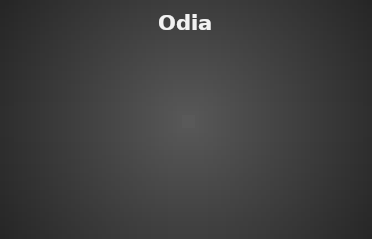
| Category | Odia Grammar |
|---|---|
| % of Students passed | 0 |
| % of Students need improvement | 0 |